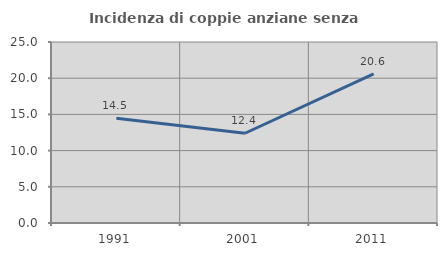
| Category | Incidenza di coppie anziane senza figli  |
|---|---|
| 1991.0 | 14.458 |
| 2001.0 | 12.397 |
| 2011.0 | 20.588 |